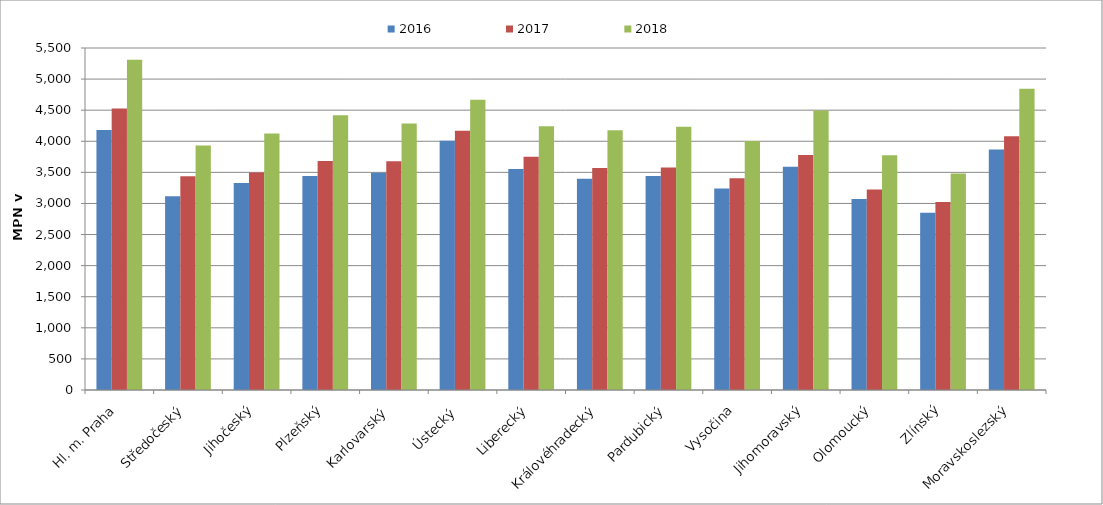
| Category | 2016 | 2017 | 2018 |
|---|---|---|---|
| Hl. m. Praha | 4181.835 | 4527.743 | 5312.364 |
| Středočeský | 3117.391 | 3436.126 | 3933.597 |
| Jihočeský | 3330.898 | 3497.684 | 4123.81 |
| Plzeňský | 3441.485 | 3682.458 | 4418.95 |
| Karlovarský  | 3492.756 | 3677.978 | 4286.565 |
| Ústecký   | 4008.383 | 4168.707 | 4668.826 |
| Liberecký | 3554.044 | 3749.178 | 4240.917 |
| Královéhradecký | 3399.142 | 3569.099 | 4175.843 |
| Pardubický | 3439.817 | 3577.516 | 4233.751 |
| Vysočina | 3239.519 | 3404.111 | 4003.275 |
| Jihomoravský | 3588.691 | 3779.963 | 4495.144 |
| Olomoucký | 3072.039 | 3225.69 | 3774.023 |
| Zlínský | 2848.665 | 3024.586 | 3482.329 |
| Moravskoslezský | 3868.402 | 4081.42 | 4845.444 |